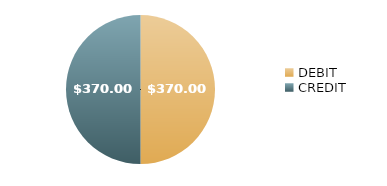
| Category | $370.00 $370.00 |
|---|---|
| DEBIT | 370 |
| CREDIT | 370 |